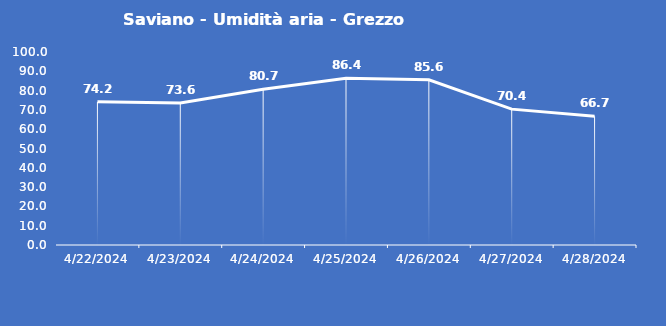
| Category | Saviano - Umidità aria - Grezzo (%) |
|---|---|
| 4/22/24 | 74.2 |
| 4/23/24 | 73.6 |
| 4/24/24 | 80.7 |
| 4/25/24 | 86.4 |
| 4/26/24 | 85.6 |
| 4/27/24 | 70.4 |
| 4/28/24 | 66.7 |